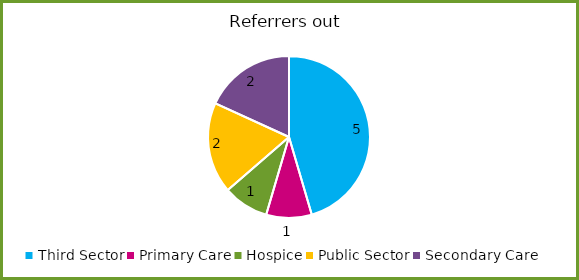
| Category | Series 0 |
|---|---|
| Third Sector | 5 |
| Primary Care | 1 |
| Hospice | 1 |
| Public Sector | 2 |
| Secondary Care | 2 |